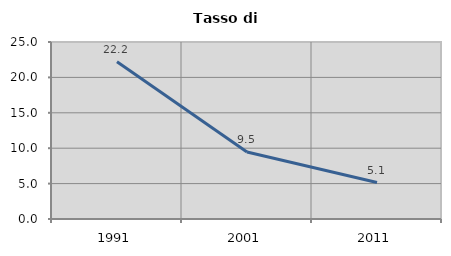
| Category | Tasso di disoccupazione   |
|---|---|
| 1991.0 | 22.199 |
| 2001.0 | 9.463 |
| 2011.0 | 5.149 |